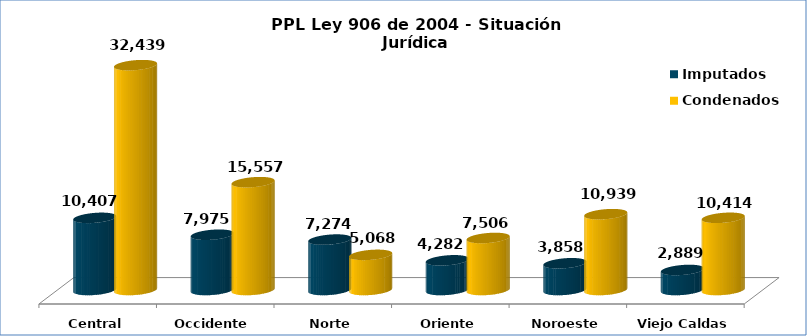
| Category | Imputados | Condenados |
|---|---|---|
| Central | 10407 | 32439 |
| Occidente | 7975 | 15557 |
| Norte | 7274 | 5068 |
| Oriente | 4282 | 7506 |
| Noroeste | 3858 | 10939 |
| Viejo Caldas | 2889 | 10414 |